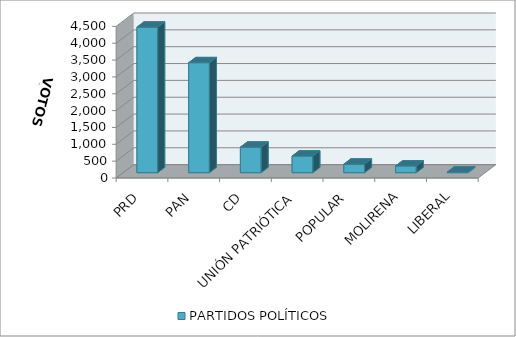
| Category | PARTIDOS POLÍTICOS |
|---|---|
| PRD | 4320 |
| PAN | 3264 |
| CD | 758 |
| UNIÓN PATRIÓTICA | 494 |
| POPULAR | 253 |
| MOLIRENA | 199 |
| LIBERAL | 19 |